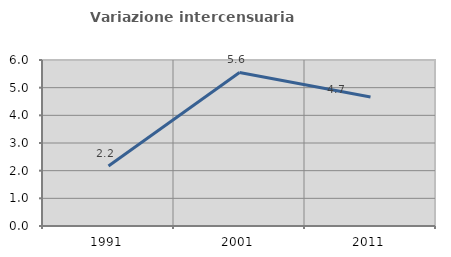
| Category | Variazione intercensuaria annua |
|---|---|
| 1991.0 | 2.169 |
| 2001.0 | 5.551 |
| 2011.0 | 4.665 |